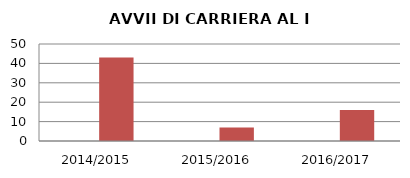
| Category | ANNO | NUMERO |
|---|---|---|
| 2014/2015 | 0 | 43 |
| 2015/2016 | 0 | 7 |
| 2016/2017 | 0 | 16 |